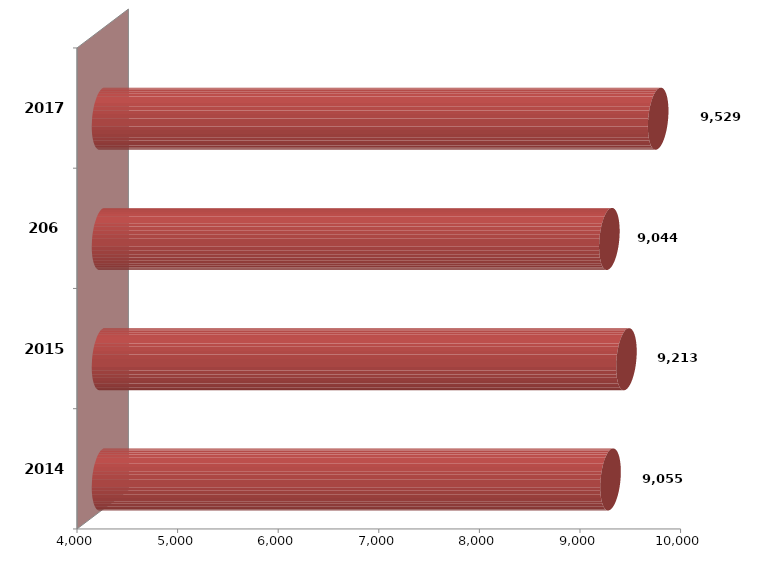
| Category | Series 1 | Series 2 |
|---|---|---|
| 2014.0 | 9055300 |  |
| 2015.0 | 9213152 |  |
| 206.0 | 9043605.283 |  |
| 2017.0 | 9528784.616 |  |